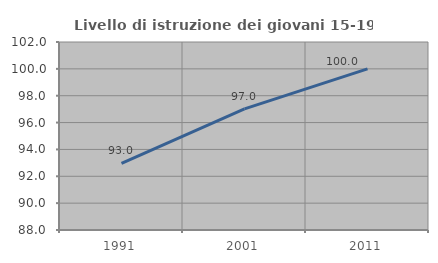
| Category | Livello di istruzione dei giovani 15-19 anni |
|---|---|
| 1991.0 | 92.969 |
| 2001.0 | 97.021 |
| 2011.0 | 100 |